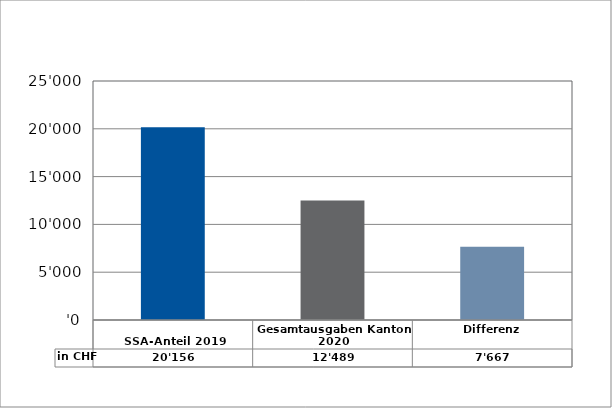
| Category | in CHF |
|---|---|
| 
SSA-Anteil 2019

 | 20156 |
| Gesamtausgaben Kanton 2020
 | 12488.7 |
| Differenz | 7667.3 |